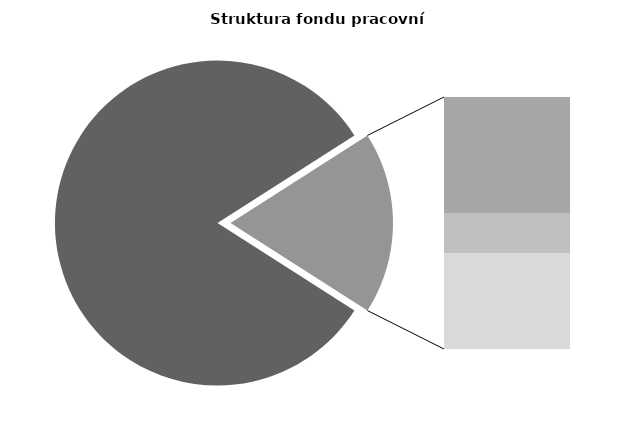
| Category | Series 0 |
|---|---|
| Průměrná měsíční odpracovaná doba bez přesčasu | 141.102 |
| Dovolená | 14.356 |
| Nemoc | 5.02 |
| Jiné | 11.827 |